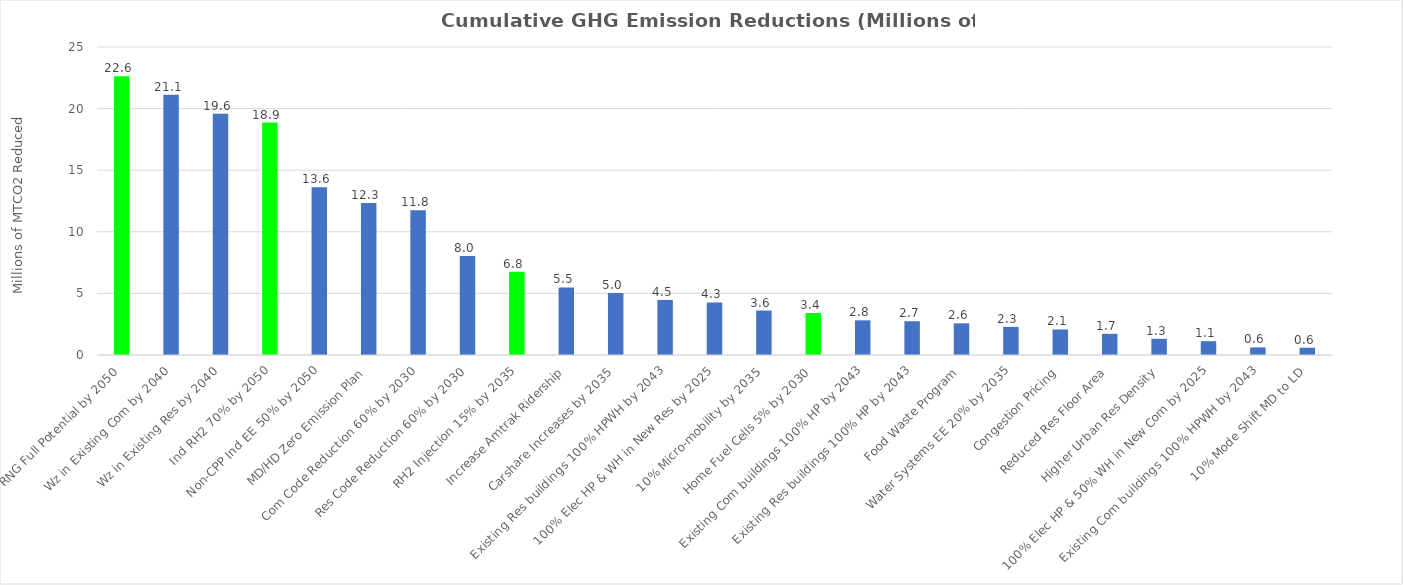
| Category | Series 0 |
|---|---|
| RNG Full Potential by 2050 | 22.617 |
| Wz in Existing Com by 2040 | 21.128 |
| Wz in Existing Res by 2040 | 19.578 |
| Ind RH2 70% by 2050 | 18.863 |
| Non-CPP Ind EE 50% by 2050 | 13.621 |
| MD/HD Zero Emission Plan | 12.337 |
| Com Code Reduction 60% by 2030 | 11.751 |
| Res Code Reduction 60% by 2030 | 8.044 |
| RH2 Injection 15% by 2035 | 6.763 |
| Increase Amtrak Ridership | 5.488 |
| Carshare Increases by 2035 | 5.034 |
| Existing Res buildings 100% HPWH by 2043 | 4.47 |
| 100% Elec HP & WH in New Res by 2025 | 4.269 |
| 10% Micro-mobility by 2035 | 3.607 |
| Home Fuel Cells 5% by 2030 | 3.409 |
| Existing Com buildings 100% HP by 2043 | 2.813 |
| Existing Res buildings 100% HP by 2043 | 2.74 |
| Food Waste Program | 2.572 |
| Water Systems EE 20% by 2035 | 2.286 |
| Congestion Pricing | 2.073 |
| Reduced Res Floor Area | 1.718 |
| Higher Urban Res Density | 1.315 |
| 100% Elec HP & 50% WH in New Com by 2025 | 1.123 |
| Existing Com buildings 100% HPWH by 2043 | 0.617 |
| 10% Mode Shift MD to LD | 0.588 |